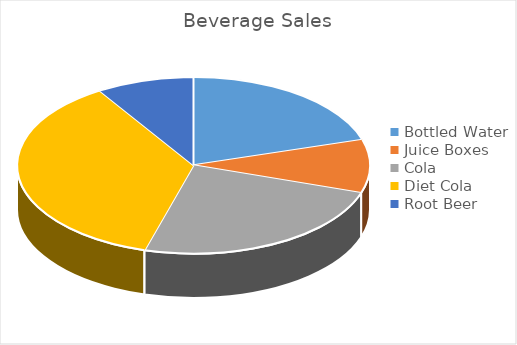
| Category | Units |
|---|---|
| Bottled Water | 25000 |
| Juice Boxes | 12000 |
| Cola | 30000 |
| Diet Cola | 45000 |
| Root Beer | 11000 |